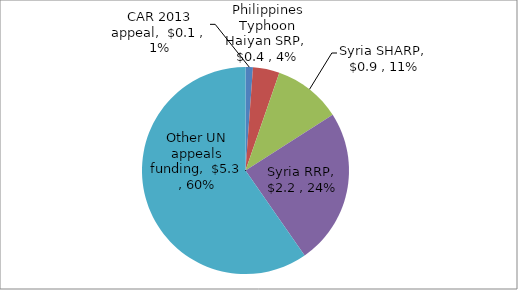
| Category | US$ billions |
|---|---|
| CAR 2013 appeal | 0.103 |
| Philippines Typhoon Haiyan SRP | 0.369 |
| Syria SHARP | 0.948 |
| Syria RRP | 2.171 |
| Other UN appeals funding | 5.316 |